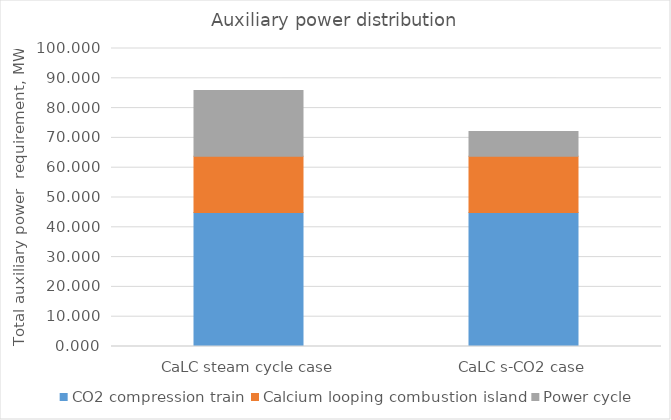
| Category | CO2 compression train | Calcium looping combustion island | Power cycle |
|---|---|---|---|
| CaLC steam cycle case | 44.979 | 18.882 | 22.084 |
| CaLC s-CO2 case | 44.993 | 18.889 | 8.288 |